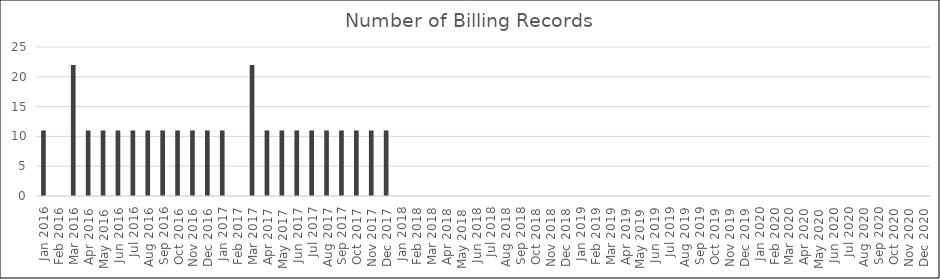
| Category | Num Records |
|---|---|
| Jan 2016 | 11 |
| Feb 2016 | 0 |
| Mar 2016 | 22 |
| Apr 2016 | 11 |
| May 2016 | 11 |
| Jun 2016 | 11 |
| Jul 2016 | 11 |
| Aug 2016 | 11 |
| Sep 2016 | 11 |
| Oct 2016 | 11 |
| Nov 2016 | 11 |
| Dec 2016 | 11 |
| Jan 2017 | 11 |
| Feb 2017 | 0 |
| Mar 2017 | 22 |
| Apr 2017 | 11 |
| May 2017 | 11 |
| Jun 2017 | 11 |
| Jul 2017 | 11 |
| Aug 2017 | 11 |
| Sep 2017 | 11 |
| Oct 2017 | 11 |
| Nov 2017 | 11 |
| Dec 2017 | 11 |
| Jan 2018 | 0 |
| Feb 2018 | 0 |
| Mar 2018 | 0 |
| Apr 2018 | 0 |
| May 2018 | 0 |
| Jun 2018 | 0 |
| Jul 2018 | 0 |
| Aug 2018 | 0 |
| Sep 2018 | 0 |
| Oct 2018 | 0 |
| Nov 2018 | 0 |
| Dec 2018 | 0 |
| Jan 2019 | 0 |
| Feb 2019 | 0 |
| Mar 2019 | 0 |
| Apr 2019 | 0 |
| May 2019 | 0 |
| Jun 2019 | 0 |
| Jul 2019 | 0 |
| Aug 2019 | 0 |
| Sep 2019 | 0 |
| Oct 2019 | 0 |
| Nov 2019 | 0 |
| Dec 2019 | 0 |
| Jan 2020 | 0 |
| Feb 2020 | 0 |
| Mar 2020 | 0 |
| Apr 2020 | 0 |
| May 2020 | 0 |
| Jun 2020 | 0 |
| Jul 2020 | 0 |
| Aug 2020 | 0 |
| Sep 2020 | 0 |
| Oct 2020 | 0 |
| Nov 2020 | 0 |
| Dec 2020 | 0 |